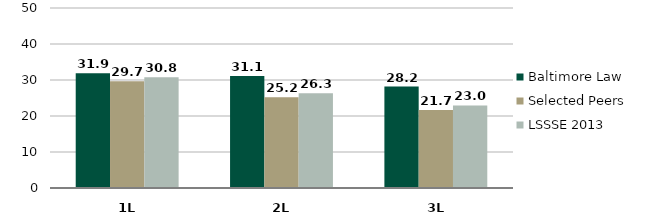
| Category | Baltimore Law | Selected Peers | LSSSE 2013 |
|---|---|---|---|
| 0 | 31.852 | 29.667 | 30.791 |
| 1 | 31.141 | 25.206 | 26.316 |
| 2 | 28.186 | 21.665 | 22.95 |